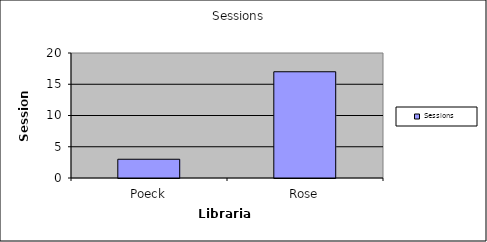
| Category | Sessions |
|---|---|
| Poeck | 3 |
| Rose | 17 |